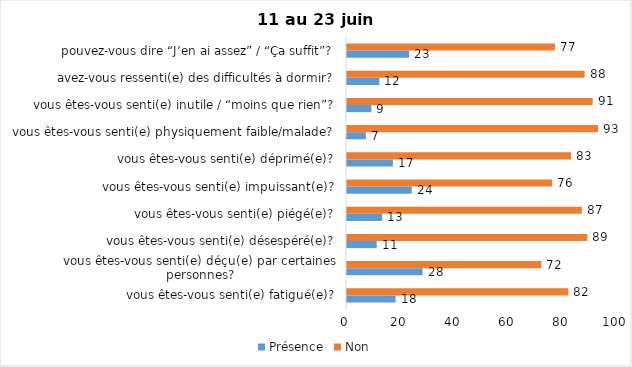
| Category | Présence | Non |
|---|---|---|
| vous êtes-vous senti(e) fatigué(e)? | 18 | 82 |
| vous êtes-vous senti(e) déçu(e) par certaines personnes? | 28 | 72 |
| vous êtes-vous senti(e) désespéré(e)? | 11 | 89 |
| vous êtes-vous senti(e) piégé(e)? | 13 | 87 |
| vous êtes-vous senti(e) impuissant(e)? | 24 | 76 |
| vous êtes-vous senti(e) déprimé(e)? | 17 | 83 |
| vous êtes-vous senti(e) physiquement faible/malade? | 7 | 93 |
| vous êtes-vous senti(e) inutile / “moins que rien”? | 9 | 91 |
| avez-vous ressenti(e) des difficultés à dormir? | 12 | 88 |
| pouvez-vous dire “J’en ai assez” / “Ça suffit”? | 23 | 77 |